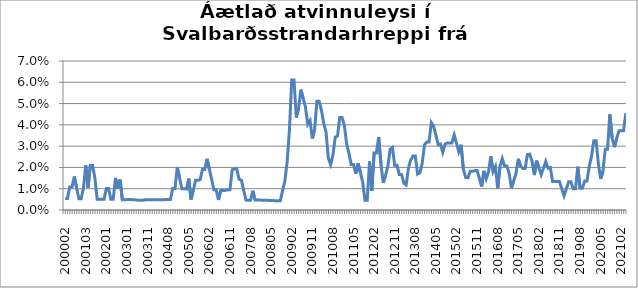
| Category | Series 0 |
|---|---|
| 200002 | 0.005 |
| 200003 | 0.005 |
| 200005 | 0.011 |
| 200006 | 0.011 |
| 200007 | 0.016 |
| 200008 | 0.01 |
| 200012 | 0.005 |
| 200101 | 0.005 |
| 200102 | 0.01 |
| 200103 | 0.021 |
| 200104 | 0.01 |
| 200105 | 0.021 |
| 200106 | 0.021 |
| 200107 | 0.015 |
| 200108 | 0.005 |
| 200109 | 0.005 |
| 200111 | 0.005 |
| 200112 | 0.005 |
| 200201 | 0.01 |
| 200202 | 0.01 |
| 200203 | 0.005 |
| 200204 | 0.005 |
| 200205 | 0.015 |
| 200206 | 0.01 |
| 200207 | 0.014 |
| 200209 | 0.005 |
| 200210 | 0.005 |
| 200301 | 0.005 |
| 200302 | 0.005 |
| 200303 | 0.005 |
| 200304 | 0.005 |
| 200305 | 0.005 |
| 200307 | 0.005 |
| 200308 | 0.005 |
| 200309 | 0.005 |
| 200310 | 0.005 |
| 200311 | 0.005 |
| 200312 | 0.005 |
| 200401 | 0.005 |
| 200402 | 0.005 |
| 200403 | 0.005 |
| 200404 | 0.005 |
| 200405 | 0.005 |
| 200406 | 0.005 |
| 200407 | 0.005 |
| 200408 | 0.005 |
| 200409 | 0.005 |
| 200410 | 0.01 |
| 200411 | 0.01 |
| 200412 | 0.02 |
| 200501 | 0.015 |
| 200502 | 0.01 |
| 200503 | 0.01 |
| 200504 | 0.01 |
| 200505 | 0.015 |
| 200506 | 0.005 |
| 200507 | 0.009 |
| 200508 | 0.014 |
| 200509 | 0.014 |
| 200510 | 0.014 |
| 200511 | 0.019 |
| 200512 | 0.019 |
| 200601 | 0.024 |
| 200602 | 0.019 |
| 200603 | 0.014 |
| 200604 | 0.009 |
| 200605 | 0.009 |
| 200606 | 0.005 |
| 200607 | 0.009 |
| 200608 | 0.009 |
| 200609 | 0.009 |
| 200610 | 0.009 |
| 200611 | 0.009 |
| 200612 | 0.019 |
| 200701 | 0.019 |
| 200702 | 0.019 |
| 200703 | 0.014 |
| 200704 | 0.014 |
| 200705 | 0.009 |
| 200706 | 0.005 |
| 200707 | 0.005 |
| 200708 | 0.005 |
| 200709 | 0.009 |
| 200710 | 0.005 |
| 200711 | 0.005 |
| 200712 | 0.005 |
| 200801 | 0.005 |
| 200802 | 0.005 |
| 200803 | 0.005 |
| 200804 | 0.004 |
| 200805 | 0.004 |
| 200806 | 0.004 |
| 200807 | 0.004 |
| 200808 | 0.004 |
| 200809 | 0.004 |
| 200810 | 0.009 |
| 200811 | 0.014 |
| 200812 | 0.023 |
| 200901 | 0.038 |
| 200902 | 0.061 |
| 200903 | 0.061 |
| 200904 | 0.043 |
| 200905 | 0.048 |
| 200906 | 0.057 |
| 200907 | 0.052 |
| 200908 | 0.048 |
| 200909 | 0.04 |
| 200910 | 0.042 |
| 200911 | 0.034 |
| 200912 | 0.038 |
| 201001 | 0.051 |
| 201002 | 0.051 |
| 201003 | 0.047 |
| 201004 | 0.041 |
| 201005 | 0.037 |
| 201006 | 0.024 |
| 201007 | 0.021 |
| 201008 | 0.026 |
| 201009 | 0.034 |
| 201010 | 0.035 |
| 201011 | 0.043 |
| 201012 | 0.043 |
| 201101 | 0.04 |
| 201102 | 0.031 |
| 201103 | 0.027 |
| 201104 | 0.021 |
| 201105 | 0.021 |
| 201106 | 0.017 |
| 201107 | 0.022 |
| 201108 | 0.018 |
| 201109 | 0.013 |
| 201110 | 0.005 |
| 201111 | 0.005 |
| 201112 | 0.023 |
| 201201 | 0.009 |
| 201202 | 0.027 |
| 201203 | 0.027 |
| 201204 | 0.034 |
| 201205 | 0.021 |
| 201206 | 0.013 |
| 201207 | 0.016 |
| 201208 | 0.02 |
| 201209 | 0.029 |
| 201210 | 0.029 |
| 201211 | 0.021 |
| 201212 | 0.021 |
| 201301 | 0.017 |
| 201302 | 0.017 |
| 201303 | 0.013 |
| 201304 | 0.012 |
| 201305 | 0.02 |
| 201306 | 0.024 |
| 201307 | 0.025 |
| 201308 | 0.025 |
| 201309 | 0.017 |
| 201310 | 0.017 |
| 201311 | 0.022 |
| 201312 | 0.031 |
| 201401 | 0.032 |
| 201402 | 0.032 |
| 201403 | 0.041 |
| 201404 | 0.039 |
| 201405 | 0.035 |
| 201406 | 0.031 |
| 201407 | 0.031 |
| 201408 | 0.027 |
| 201409 | 0.031 |
| 201410 | 0.031 |
| 201411 | 0.031 |
| 201412 | 0.031 |
| 201501 | 0.035 |
| 201502 | 0.031 |
| 201503 | 0.027 |
| 201504 | 0.031 |
| 201505 | 0.019 |
| 201506 | 0.015 |
| 201507 | 0.015 |
| 201508 | 0.018 |
| 201509 | 0.018 |
| 201510 | 0.019 |
| 201511 | 0.019 |
| 201512 | 0.015 |
| 201601 | 0.011 |
| 201602 | 0.018 |
| 201603 | 0.015 |
| 201604 | 0.018 |
| 201605 | 0.025 |
| 201606 | 0.018 |
| 201607 | 0.02 |
| 201608 | 0.01 |
| 201609 | 0.02 |
| 201610 | 0.024 |
| 201611 | 0.021 |
| 201612 | 0.021 |
| 201701 | 0.017 |
| 201702 | 0.01 |
| 201703 | 0.014 |
| 201704 | 0.017 |
| 201705 | 0.024 |
| 201706 | 0.021 |
| 201707 | 0.02 |
| 201708 | 0.02 |
| 201709 | 0.026 |
| 201710 | 0.026 |
| 201711 | 0.023 |
| 201712 | 0.016 |
| 201801 | 0.023 |
| 201802 | 0.02 |
| 201803 | 0.017 |
| 201804 | 0.02 |
| 201805 | 0.023 |
| 201806 | 0.02 |
| 201807 | 0.02 |
| 201808 | 0.013 |
| 201809 | 0.013 |
| 201810 | 0.013 |
| 201811 | 0.013 |
| 201812 | 0.01 |
| 201901 | 0.007 |
| 201902 | 0.01 |
| 201903 | 0.013 |
| 201904 | 0.013 |
| 201905 | 0.01 |
| 201906 | 0.01 |
| 201907 | 0.02 |
| 201908 | 0.01 |
| 201909 | 0.01 |
| 201910 | 0.014 |
| 201911 | 0.014 |
| 201912 | 0.02 |
| 202001 | 0.025 |
| 202002 | 0.032 |
| 202003 | 0.032 |
| 202004 | 0.022 |
| 202005 | 0.015 |
| 202006 | 0.018 |
| 202007 | 0.029 |
| 202008 | 0.029 |
| 202009 | 0.045 |
| 202010 | 0.034 |
| 202011 | 0.03 |
| 202012 | 0.034 |
| 202101 | 0.037 |
| 202102 | 0.037 |
| 202103 | 0.037 |
| 202104 | 0.045 |